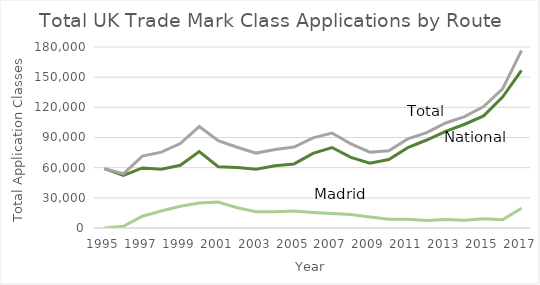
| Category | National | Madrid2 | Total |
|---|---|---|---|
| 1995.0 | 59053 | 0 | 59053 |
| 1996.0 | 52206 | 1707 | 53913 |
| 1997.0 | 59760 | 11703 | 71463 |
| 1998.0 | 58531 | 16930 | 75461 |
| 1999.0 | 62340 | 21602 | 83942 |
| 2000.0 | 75957 | 24950 | 100907 |
| 2001.0 | 61001 | 25836 | 86837 |
| 2002.0 | 60065 | 20203 | 80268 |
| 2003.0 | 58370 | 16125 | 74495 |
| 2004.0 | 61931 | 16173 | 78104 |
| 2005.0 | 63726 | 16817 | 80543 |
| 2006.0 | 74146 | 15530 | 89676 |
| 2007.0 | 80033 | 14440 | 94473 |
| 2008.0 | 70240 | 13445 | 83685 |
| 2009.0 | 64431 | 10937 | 75368 |
| 2010.0 | 68141 | 8715 | 76856 |
| 2011.0 | 79898 | 8706 | 88604 |
| 2012.0 | 87509 | 7371 | 94880 |
| 2013.0 | 96095 | 8348 | 104443 |
| 2014.0 | 103186 | 7652 | 110838 |
| 2015.0 | 111487 | 9305 | 120792 |
| 2016.0 | 130230 | 8179 | 138409 |
| 2017.0 | 156837 | 19656 | 176493 |